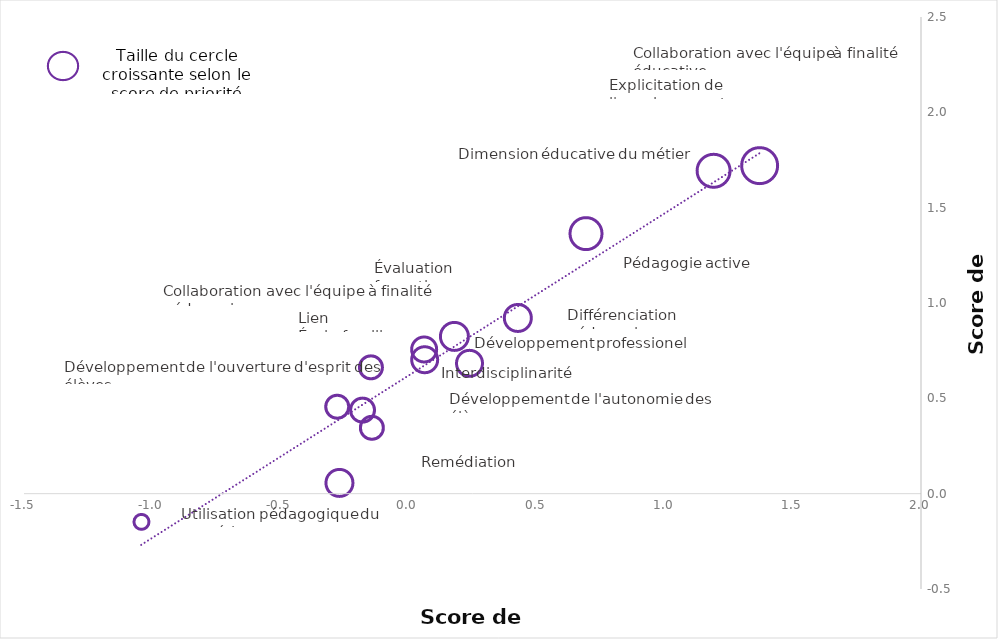
| Category | Dimensions selon la fréquence/faisabilté/priorité |
|---|---|
| -1.04272933 | -0.146 |
| -0.27974143 | 0.459 |
| -0.14743954 | 0.664 |
| -0.14372809 | 0.347 |
| -0.18102582 | 0.441 |
| 0.06034722 | 0.758 |
| 0.06282392 | 0.703 |
| 0.23783419 | 0.684 |
| 0.4258519 | 0.923 |
| -0.26927724 | 0.057 |
| 0.17796463 | 0.827 |
| 0.69129692 | 1.366 |
| 1.18912591 | 1.696 |
| 1.36938582 | 1.722 |